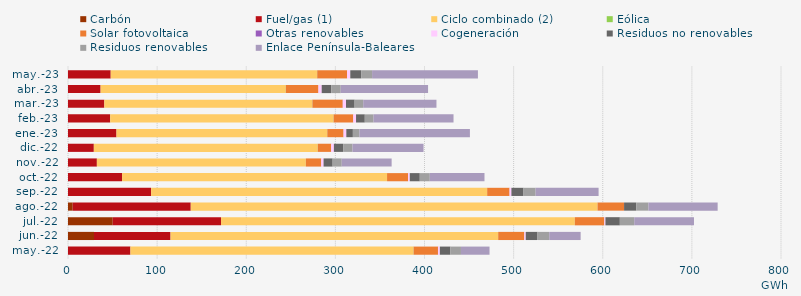
| Category | Carbón | Fuel/gas (1) | Ciclo combinado (2) | Eólica | Solar fotovoltaica | Otras renovables | Cogeneración | Residuos no renovables | Residuos renovables | Enlace Península-Baleares |
|---|---|---|---|---|---|---|---|---|---|---|
| may.-22 | -1.03 | 70.043 | 317.556 | 0.161 | 27.351 | 0.166 | 1.946 | 11.846 | 11.846 | 32.047 |
| jun.-22 | 29.142 | 85.898 | 367.588 | 0.061 | 29.268 | 0.111 | 1.536 | 13.186 | 13.186 | 35.225 |
| jul.-22 | 50.189 | 121.497 | 396.96 | 0.03 | 33.07 | 0.095 | 1.172 | 16.161 | 16.161 | 67.033 |
| ago.-22 | 5.265 | 132.469 | 456.377 | 0.032 | 29.671 | 0.057 | 0.051 | 13.672 | 13.672 | 77.653 |
| sep.-22 | -0.604 | 93.246 | 377.074 | 0.013 | 25.078 | 0.072 | 2.037 | 13.582 | 13.582 | 70.647 |
| oct.-22 | -0.613 | 60.669 | 297.321 | 0.003 | 23.564 | 0.097 | 1.827 | 11.231 | 11.231 | 61.365 |
| nov.-22 | -0.588 | 32.394 | 234.48 | 0.026 | 17.218 | 0.085 | 2.554 | 10.189 | 10.189 | 55.992 |
| dic.-22 | -0.627 | 28.98 | 251.185 | 0.101 | 15.034 | 0.077 | 2.941 | 10.414 | 10.414 | 79.779 |
| ene.-23 | -0.728 | 54.403 | 236.334 | 0.216 | 18.177 | 0.094 | 3.056 | 7.362 | 7.362 | 123.95 |
| feb.-23 | -0.707 | 47.337 | 250.507 | 0.183 | 21.959 | 0.136 | 3.052 | 9.83 | 9.83 | 89.734 |
| mar.-23 | -0.518 | 40.752 | 233.282 | 0.2 | 34.018 | 0.112 | 3.586 | 9.638 | 9.638 | 82.194 |
| abr.-23 | -0.609 | 36.577 | 207.738 | 0.127 | 36.519 | 0.074 | 3.62 | 10.657 | 10.657 | 98.033 |
| may.-23 | -0.833 | 47.925 | 231.475 | 0.25 | 33.46 | 0.09 | 3.518 | 12.229 | 12.229 | 118.762 |